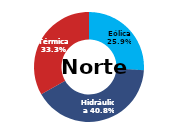
| Category | Norte |
|---|---|
| Eólica | 81.17 |
| Hidráulica | 127.665 |
| Solar | 0 |
| Térmica | 104.093 |